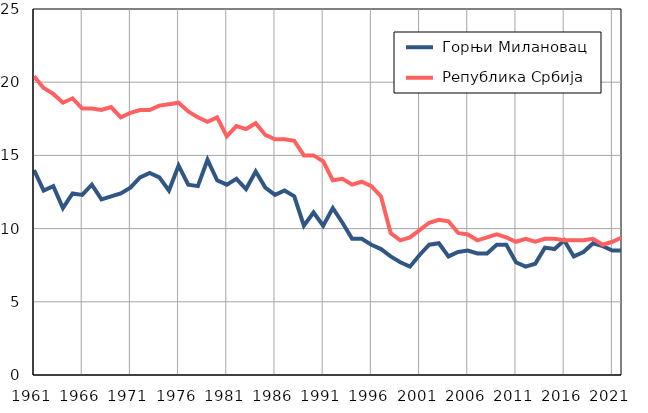
| Category |  Горњи Милановац |  Република Србија |
|---|---|---|
| 1961.0 | 14 | 20.4 |
| 1962.0 | 12.6 | 19.6 |
| 1963.0 | 12.9 | 19.2 |
| 1964.0 | 11.4 | 18.6 |
| 1965.0 | 12.4 | 18.9 |
| 1966.0 | 12.3 | 18.2 |
| 1967.0 | 13 | 18.2 |
| 1968.0 | 12 | 18.1 |
| 1969.0 | 12.2 | 18.3 |
| 1970.0 | 12.4 | 17.6 |
| 1971.0 | 12.8 | 17.9 |
| 1972.0 | 13.5 | 18.1 |
| 1973.0 | 13.8 | 18.1 |
| 1974.0 | 13.5 | 18.4 |
| 1975.0 | 12.6 | 18.5 |
| 1976.0 | 14.3 | 18.6 |
| 1977.0 | 13 | 18 |
| 1978.0 | 12.9 | 17.6 |
| 1979.0 | 14.7 | 17.3 |
| 1980.0 | 13.3 | 17.6 |
| 1981.0 | 13 | 16.3 |
| 1982.0 | 13.4 | 17 |
| 1983.0 | 12.7 | 16.8 |
| 1984.0 | 13.9 | 17.2 |
| 1985.0 | 12.8 | 16.4 |
| 1986.0 | 12.3 | 16.1 |
| 1987.0 | 12.6 | 16.1 |
| 1988.0 | 12.2 | 16 |
| 1989.0 | 10.2 | 15 |
| 1990.0 | 11.1 | 15 |
| 1991.0 | 10.2 | 14.6 |
| 1992.0 | 11.4 | 13.3 |
| 1993.0 | 10.4 | 13.4 |
| 1994.0 | 9.3 | 13 |
| 1995.0 | 9.3 | 13.2 |
| 1996.0 | 8.9 | 12.9 |
| 1997.0 | 8.6 | 12.2 |
| 1998.0 | 8.1 | 9.7 |
| 1999.0 | 7.7 | 9.2 |
| 2000.0 | 7.4 | 9.4 |
| 2001.0 | 8.2 | 9.9 |
| 2002.0 | 8.9 | 10.4 |
| 2003.0 | 9 | 10.6 |
| 2004.0 | 8.1 | 10.5 |
| 2005.0 | 8.4 | 9.7 |
| 2006.0 | 8.5 | 9.6 |
| 2007.0 | 8.3 | 9.2 |
| 2008.0 | 8.3 | 9.4 |
| 2009.0 | 8.9 | 9.6 |
| 2010.0 | 8.9 | 9.4 |
| 2011.0 | 7.7 | 9.1 |
| 2012.0 | 7.4 | 9.3 |
| 2013.0 | 7.6 | 9.1 |
| 2014.0 | 8.7 | 9.3 |
| 2015.0 | 8.6 | 9.3 |
| 2016.0 | 9.2 | 9.2 |
| 2017.0 | 8.1 | 9.2 |
| 2018.0 | 8.4 | 9.2 |
| 2019.0 | 9 | 9.3 |
| 2020.0 | 8.8 | 8.9 |
| 2021.0 | 8.5 | 9.1 |
| 2022.0 | 8.5 | 9.4 |